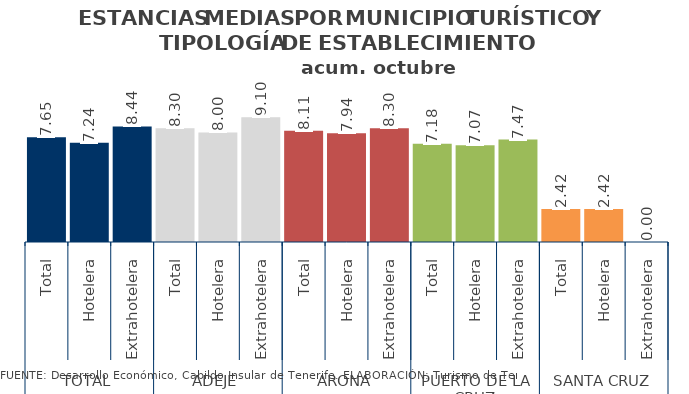
| Category | Series 2 |
|---|---|
| 0 | 7.651 |
| 1 | 7.245 |
| 2 | 8.436 |
| 3 | 8.304 |
| 4 | 8.001 |
| 5 | 9.097 |
| 6 | 8.113 |
| 7 | 7.937 |
| 8 | 8.296 |
| 9 | 7.18 |
| 10 | 7.07 |
| 11 | 7.473 |
| 12 | 2.417 |
| 13 | 2.417 |
| 14 | 0 |